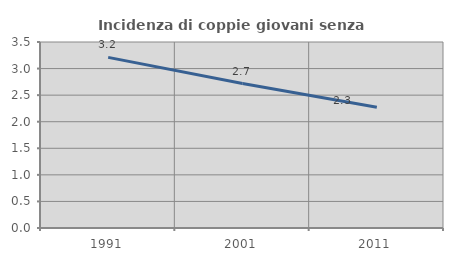
| Category | Incidenza di coppie giovani senza figli |
|---|---|
| 1991.0 | 3.211 |
| 2001.0 | 2.717 |
| 2011.0 | 2.273 |